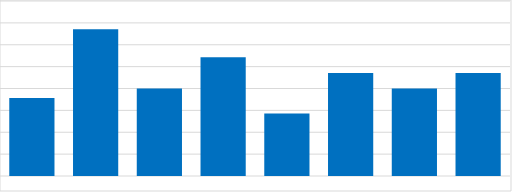
| Category | Series 0 |
|---|---|
| USD | 3.571 |
| EUR | 6.714 |
| GBP | 4 |
| CHF | 5.429 |
| CAD | 2.857 |
| AUD | 4.714 |
| NZD | 4 |
| JPY | 4.714 |